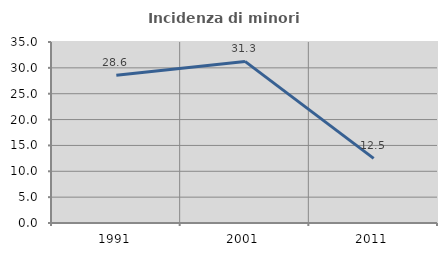
| Category | Incidenza di minori stranieri |
|---|---|
| 1991.0 | 28.571 |
| 2001.0 | 31.25 |
| 2011.0 | 12.5 |